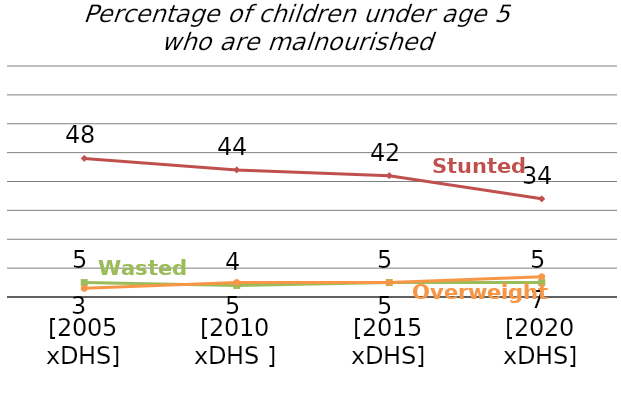
| Category | Stunted | Wasted | #REF! | Overweight |
|---|---|---|---|---|
| [2005
xDHS] | 48 | 5 |  | 3 |
| [2010
xDHS ] | 44 | 4 |  | 5 |
| [2015
xDHS] | 42 | 5 |  | 5 |
| [2020
xDHS] | 34 | 5 |  | 7 |